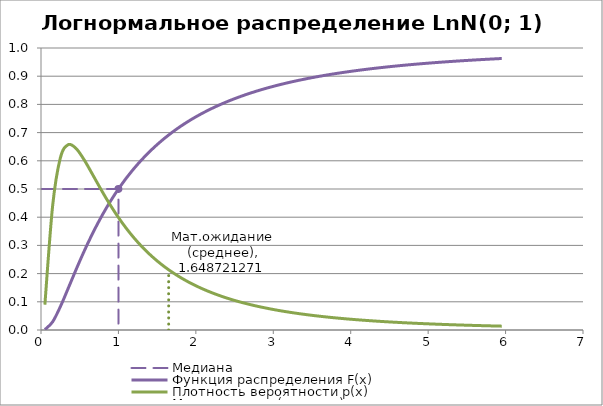
| Category | Медиана |
|---|---|
| 0.0 | 0.5 |
| 1.0 | 0.5 |
| 1.0 | 0 |